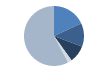
| Category | Series 0 |
|---|---|
| 0 | 180 |
| 1 | 126 |
| 2 | 92 |
| 3 | 22 |
| 4 | 574 |